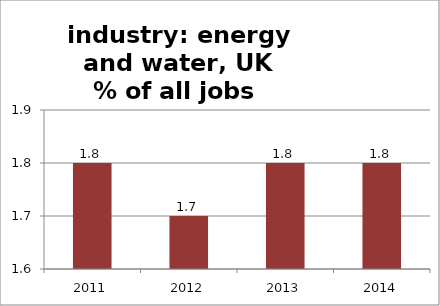
| Category | B,D,E: Energy & water |
|---|---|
| 2011.0 | 1.8 |
| 2012.0 | 1.7 |
| 2013.0 | 1.8 |
| 2014.0 | 1.8 |